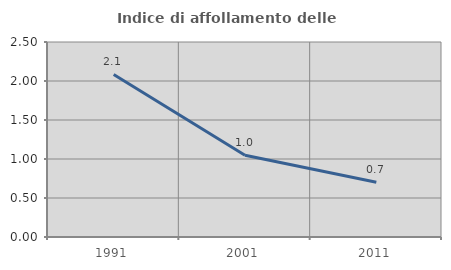
| Category | Indice di affollamento delle abitazioni  |
|---|---|
| 1991.0 | 2.085 |
| 2001.0 | 1.047 |
| 2011.0 | 0.702 |